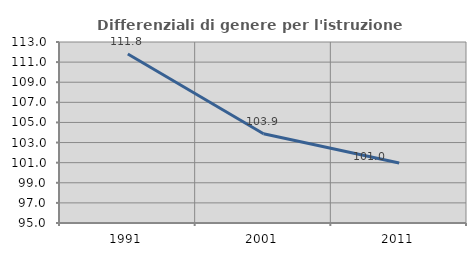
| Category | Differenziali di genere per l'istruzione superiore |
|---|---|
| 1991.0 | 111.81 |
| 2001.0 | 103.877 |
| 2011.0 | 100.963 |